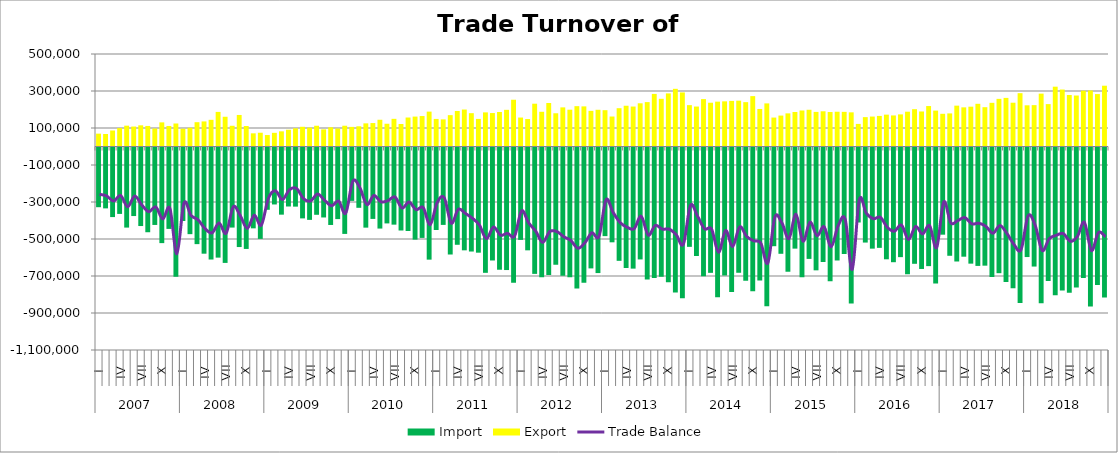
| Category | Import | Export |
|---|---|---|
| 0 | -328137.428 | 69473.835 |
| 1 | -334459.902 | 67469.561 |
| 2 | -381545.727 | 86485.258 |
| 3 | -364407.83 | 99579.043 |
| 4 | -438345.425 | 112612.284 |
| 5 | -375919.942 | 107918.489 |
| 6 | -429942.484 | 114501.191 |
| 7 | -463469.136 | 111126.511 |
| 8 | -424050.769 | 97183.969 |
| 9 | -522267.672 | 130413.835 |
| 10 | -445390.926 | 110997.546 |
| 11 | -704213.005 | 124348.947 |
| 12 | -402575.025 | 96157.037 |
| 13 | -473805.365 | 101214.427 |
| 14 | -527726.957 | 131397.232 |
| 15 | -579390.37 | 135532.592 |
| 16 | -610953.408 | 144223.295 |
| 17 | -600700.531 | 187019.429 |
| 18 | -629238.431 | 160784.767 |
| 19 | -438214.751 | 112046.47 |
| 20 | -543482.238 | 170475.427 |
| 21 | -553710.327 | 110823.513 |
| 22 | -442400.172 | 71226.822 |
| 23 | -499342.768 | 74444.228 |
| 24 | -342172.891 | 61992.595 |
| 25 | -313305.2 | 73882.564 |
| 26 | -368421.542 | 81964.131 |
| 27 | -324331.62 | 90575.384 |
| 28 | -325013.796 | 98333.759 |
| 29 | -388587.943 | 106636.938 |
| 30 | -396599.106 | 102008.498 |
| 31 | -369105.39 | 112226.511 |
| 32 | -383616.972 | 92627.175 |
| 33 | -424156.143 | 103821.906 |
| 34 | -392445.75 | 97243.451 |
| 35 | -472487.714 | 112309.489 |
| 36 | -293895.433 | 106064.492 |
| 37 | -331405.786 | 109307.304 |
| 38 | -438593.88 | 125094.217 |
| 39 | -391466.377 | 126732.826 |
| 40 | -443586.207 | 144566.325 |
| 41 | -415754.856 | 123019.4 |
| 42 | -422418.39 | 149517.049 |
| 43 | -454069.86 | 121491.454 |
| 44 | -456766.108 | 156666.699 |
| 45 | -503426.607 | 161726.515 |
| 46 | -494134.733 | 164687.607 |
| 47 | -611604.197 | 188598.168 |
| 48 | -451309.458 | 149010.644 |
| 49 | -423793.525 | 146578.748 |
| 50 | -583825.022 | 169493.189 |
| 51 | -531280.086 | 191970.173 |
| 52 | -561216.825 | 199783.493 |
| 53 | -567722.238 | 180198.594 |
| 54 | -573950.28 | 149150.663 |
| 55 | -682821.526 | 184407.918 |
| 56 | -616128.006 | 180852.789 |
| 57 | -666126.682 | 186641.23 |
| 58 | -667818.752 | 198251.768 |
| 59 | -736741.388 | 252796.62 |
| 60 | -504795.744 | 156548.304 |
| 61 | -561245.241 | 148452.793 |
| 62 | -688545.632 | 231354.031 |
| 63 | -706187.659 | 187713.44 |
| 64 | -694827.44 | 235062.822 |
| 65 | -639198.689 | 179645.423 |
| 66 | -699314.296 | 211478.747 |
| 67 | -707051.188 | 198935.781 |
| 68 | -768121.772 | 218103.736 |
| 69 | -737103.652 | 216869.809 |
| 70 | -658928.109 | 192707.068 |
| 71 | -684156.84 | 198511.792 |
| 72 | -484510.166 | 196270.253 |
| 73 | -517895.062 | 162100.421 |
| 74 | -618028.057 | 207058.123 |
| 75 | -656766.022 | 220319.968 |
| 76 | -660133.83 | 216011.247 |
| 77 | -610381.872 | 233583.127 |
| 78 | -718870.489 | 240016.286 |
| 79 | -710962.361 | 284268.477 |
| 80 | -704339.98 | 257853.114 |
| 81 | -734189.374 | 287023.64 |
| 82 | -789551.275 | 311739.566 |
| 83 | -820086.931 | 292254.741 |
| 84 | -542427.286 | 223612.854 |
| 85 | -591950.372 | 216056.361 |
| 86 | -701034.248 | 256202.016 |
| 87 | -682942.999 | 236606.206 |
| 88 | -814368.234 | 242506.121 |
| 89 | -697796.037 | 244083.524 |
| 90 | -787009.075 | 246465.522 |
| 91 | -682549.858 | 247769.838 |
| 92 | -726340.963 | 239731.245 |
| 93 | -782290.909 | 272322.182 |
| 94 | -724680.114 | 202926.728 |
| 95 | -862879.859 | 233012.969 |
| 96 | -538891.152 | 156419.793 |
| 97 | -579977.504 | 167210.896 |
| 98 | -676965.059 | 179075.373 |
| 99 | -552058.464 | 186554.958 |
| 100 | -706417.657 | 194612.062 |
| 101 | -607536.095 | 198583.755 |
| 102 | -669370.322 | 187036.287 |
| 103 | -624263.369 | 190362.202 |
| 104 | -728605.63 | 186333.061 |
| 105 | -616128.302 | 187914.12 |
| 106 | -581222.627 | 187288.327 |
| 107 | -848666.858 | 184620.727 |
| 108 | -410772.702 | 122160.969 |
| 109 | -519251.619 | 158749.443 |
| 110 | -552107.01 | 161900.102 |
| 111 | -547894.926 | 165302.85 |
| 112 | -609712.575 | 172239.015 |
| 113 | -625481.307 | 167884.862 |
| 114 | -598068.122 | 173574.954 |
| 115 | -690996.664 | 188142.545 |
| 116 | -634056.88 | 201743.962 |
| 117 | -661956.245 | 189333.815 |
| 118 | -646662.84 | 218689.735 |
| 119 | -740091.479 | 194004.02 |
| 120 | -476633.63 | 176770.495 |
| 121 | -590689.289 | 178910.081 |
| 122 | -621589.906 | 220843.521 |
| 123 | -595661.909 | 211605.86 |
| 124 | -633218.654 | 215234.782 |
| 125 | -645486.277 | 230813.253 |
| 126 | -644134.453 | 212474.806 |
| 127 | -704960.062 | 236122.257 |
| 128 | -684784.163 | 257521.119 |
| 129 | -733096.775 | 262736.792 |
| 130 | -766834.92 | 236697.74 |
| 131 | -845325.921 | 288236.739 |
| 132 | -597547.543 | 222730.176 |
| 133 | -648938.913 | 223674.133 |
| 134 | -847912.618 | 285793.704 |
| 135 | -727406.311 | 229156.774 |
| 136 | -803426.78 | 323345.406 |
| 137 | -778408.173 | 307825.623 |
| 138 | -790737.485 | 278322.686 |
| 139 | -762097.862 | 275578.559 |
| 140 | -711429.294 | 301720.561 |
| 141 | -865451.103 | 302961.366 |
| 142 | -748476.408 | 283335.909 |
| 143 | -816643.383 | 328582.452 |